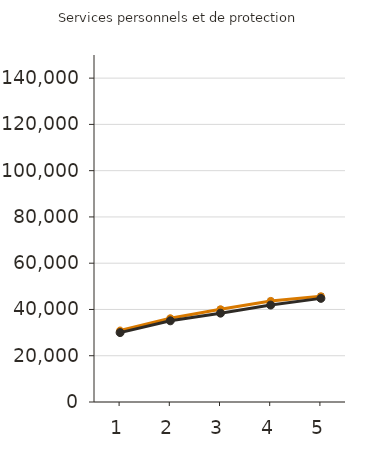
| Category | Certificat d'études collégial | Diplôme d'études collégial | Baccalauréat | Maîtrise | Doctorat | Grade professionnel |
|---|---|---|---|---|---|---|
| 1.0 | 30900 | 30000 |  |  |  |  |
| 2.0 | 36200 | 35100 |  |  |  |  |
| 3.0 | 40100 | 38400 |  |  |  |  |
| 4.0 | 43700 | 41900 |  |  |  |  |
| 5.0 | 45700 | 44800 |  |  |  |  |